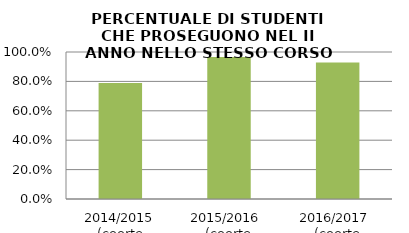
| Category | 2014/2015 (coorte 2013/14) 2015/2016  (coorte 2014/15) 2016/2017  (coorte 2015/16) |
|---|---|
| 2014/2015 (coorte 2013/14) | 0.789 |
| 2015/2016  (coorte 2014/15) | 0.966 |
| 2016/2017  (coorte 2015/16) | 0.929 |